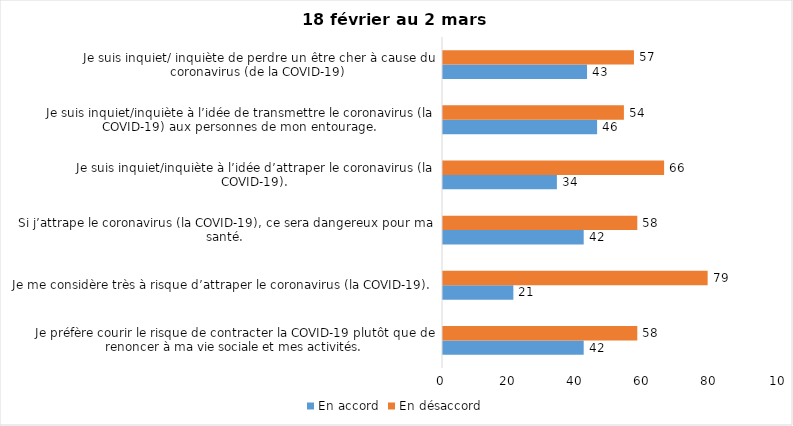
| Category | En accord | En désaccord |
|---|---|---|
| Je préfère courir le risque de contracter la COVID-19 plutôt que de renoncer à ma vie sociale et mes activités. | 42 | 58 |
| Je me considère très à risque d’attraper le coronavirus (la COVID-19). | 21 | 79 |
| Si j’attrape le coronavirus (la COVID-19), ce sera dangereux pour ma santé. | 42 | 58 |
| Je suis inquiet/inquiète à l’idée d’attraper le coronavirus (la COVID-19). | 34 | 66 |
| Je suis inquiet/inquiète à l’idée de transmettre le coronavirus (la COVID-19) aux personnes de mon entourage. | 46 | 54 |
| Je suis inquiet/ inquiète de perdre un être cher à cause du coronavirus (de la COVID-19) | 43 | 57 |